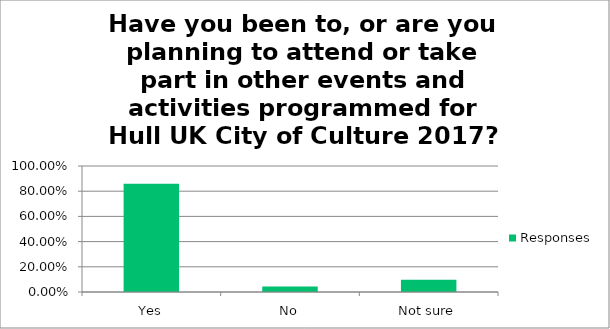
| Category | Responses |
|---|---|
| Yes | 0.859 |
| No | 0.044 |
| Not sure | 0.098 |